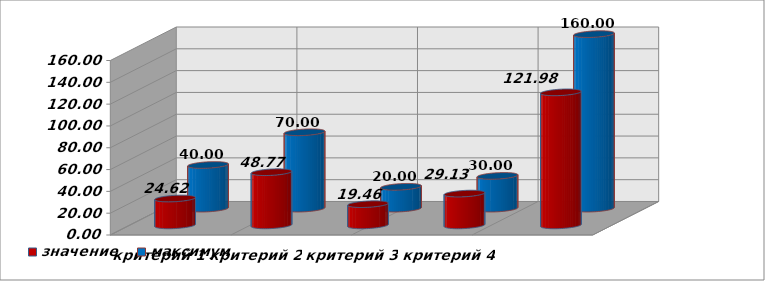
| Category | значение | максимум |
|---|---|---|
| критерий 1 | 24.62 | 40 |
| критерий 2 | 48.77 | 70 |
| критерий 3 | 19.46 | 20 |
| критерий 4 | 29.13 | 30 |